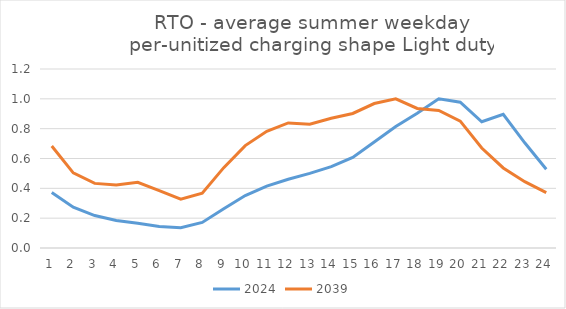
| Category | 2024 | 2039 |
|---|---|---|
| 0 | 0.373 | 0.684 |
| 1 | 0.274 | 0.504 |
| 2 | 0.217 | 0.433 |
| 3 | 0.185 | 0.422 |
| 4 | 0.166 | 0.441 |
| 5 | 0.144 | 0.384 |
| 6 | 0.136 | 0.328 |
| 7 | 0.171 | 0.368 |
| 8 | 0.263 | 0.539 |
| 9 | 0.352 | 0.686 |
| 10 | 0.415 | 0.782 |
| 11 | 0.461 | 0.838 |
| 12 | 0.5 | 0.83 |
| 13 | 0.545 | 0.87 |
| 14 | 0.608 | 0.902 |
| 15 | 0.711 | 0.969 |
| 16 | 0.814 | 1 |
| 17 | 0.904 | 0.935 |
| 18 | 1 | 0.922 |
| 19 | 0.977 | 0.85 |
| 20 | 0.846 | 0.671 |
| 21 | 0.897 | 0.537 |
| 22 | 0.705 | 0.445 |
| 23 | 0.528 | 0.371 |